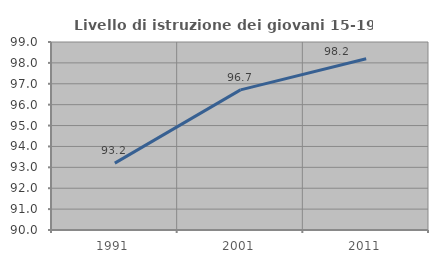
| Category | Livello di istruzione dei giovani 15-19 anni |
|---|---|
| 1991.0 | 93.201 |
| 2001.0 | 96.708 |
| 2011.0 | 98.198 |